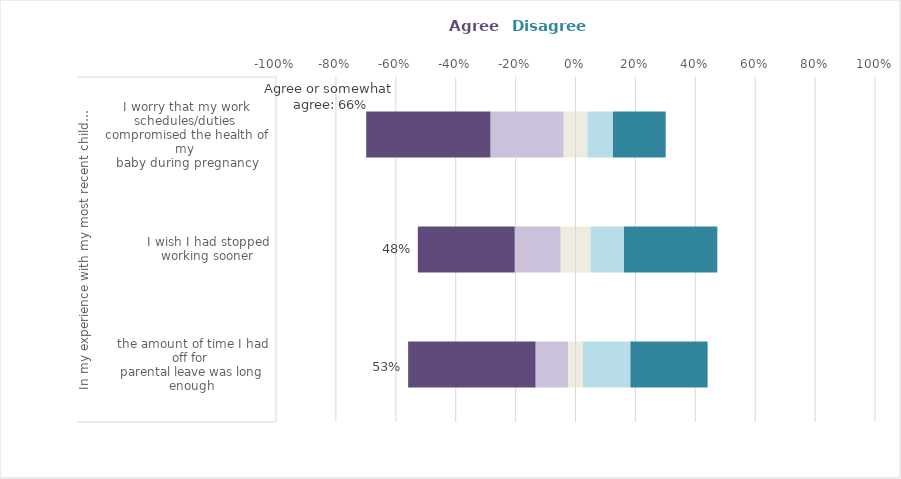
| Category | Neither agree nor disagree | Somewhat agree | Agree | Somewhat disagree | Disagree |
|---|---|---|---|---|---|
| 0 | 0.025 | -0.109 | -0.425 | 0.158 | 0.258 |
| 1 | 0.05 | -0.153 | -0.324 | 0.112 | 0.312 |
| 2 | 0.04 | -0.244 | -0.415 | 0.085 | 0.176 |